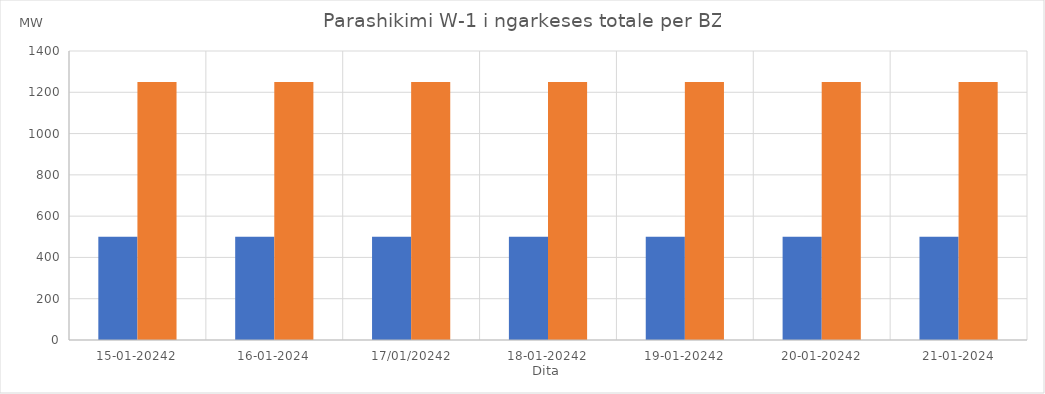
| Category | Min (MW) | Max (MW) |
|---|---|---|
| 15-01-20242 | 500 | 1250 |
| 16-01-2024 | 500 | 1250 |
| 17/01/20242 | 500 | 1250 |
| 18-01-20242 | 500 | 1250 |
| 19-01-20242 | 500 | 1250 |
| 20-01-20242 | 500 | 1250 |
| 21-01-2024 | 500 | 1250 |